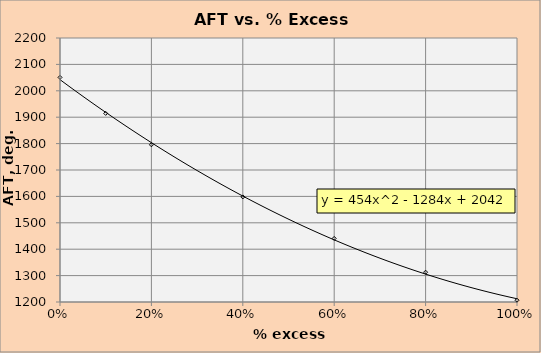
| Category | AFT |
|---|---|
| 0.0 | 2050.745 |
| 0.1 | 1914.433 |
| 0.2 | 1795.48 |
| 0.4 | 1598.007 |
| 0.6 | 1440.846 |
| 0.8 | 1312.875 |
| 1.0 | 1206.699 |